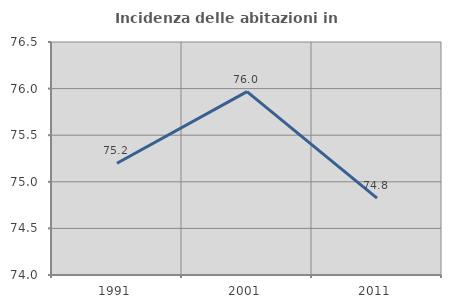
| Category | Incidenza delle abitazioni in proprietà  |
|---|---|
| 1991.0 | 75.199 |
| 2001.0 | 75.967 |
| 2011.0 | 74.824 |